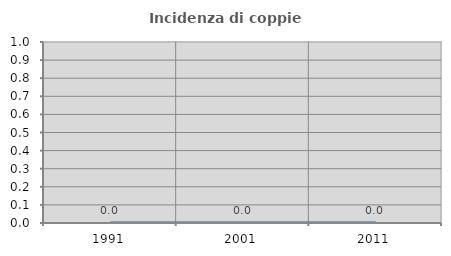
| Category | Incidenza di coppie miste |
|---|---|
| 1991.0 | 0 |
| 2001.0 | 0 |
| 2011.0 | 0 |